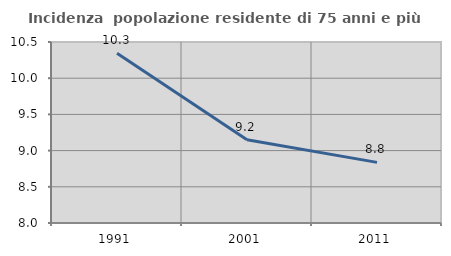
| Category | Incidenza  popolazione residente di 75 anni e più |
|---|---|
| 1991.0 | 10.345 |
| 2001.0 | 9.15 |
| 2011.0 | 8.837 |